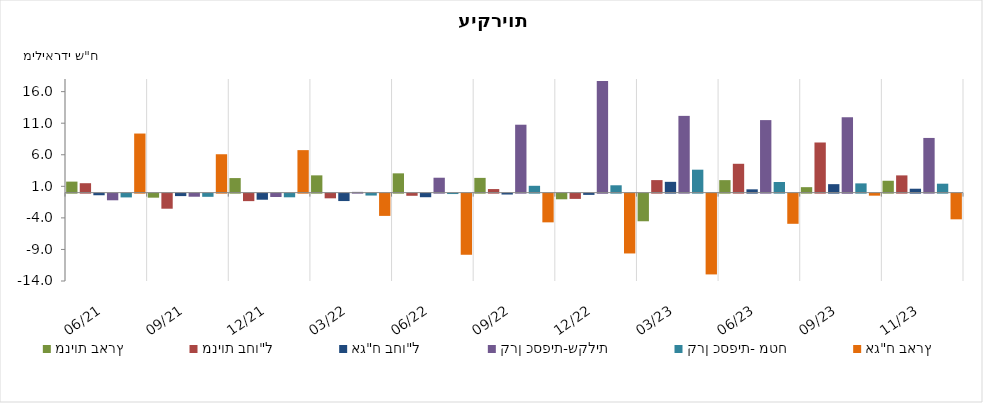
| Category | מניות בארץ | מניות בחו"ל | אג"ח בחו"ל | קרן כספית-שקלית | קרן כספית- מטח | אג"ח בארץ |
|---|---|---|---|---|---|---|
| 2021-06-30 | 1.745 | 1.492 | -0.257 | -1.055 | -0.599 | 9.361 |
| 2021-09-30 | -0.641 | -2.39 | -0.392 | -0.492 | -0.506 | 6.08 |
| 2021-12-31 | 2.305 | -1.189 | -0.967 | -0.533 | -0.581 | 6.731 |
| 2022-03-31 | 2.736 | -0.743 | -1.177 | 0.118 | -0.305 | -3.528 |
| 2022-06-30 | 3.055 | -0.343 | -0.569 | 2.36 | -0.066 | -9.686 |
| 2022-09-30 | 2.336 | 0.565 | -0.142 | 10.758 | 1.081 | -4.55 |
| 2022-12-31 | -0.895 | -0.835 | -0.198 | 17.674 | 1.163 | -9.478 |
| 2023-03-31 | -4.379 | 1.983 | 1.71 | 12.158 | 3.634 | -12.799 |
| 2023-06-30 | 1.98 | 4.569 | 0.523 | 11.488 | 1.682 | -4.781 |
| 2023-09-30 | 0.865 | 7.942 | 1.341 | 11.941 | 1.465 | -0.325 |
| 2023-11-30 | 1.881 | 2.73 | 0.618 | 8.663 | 1.415 | -4.07 |